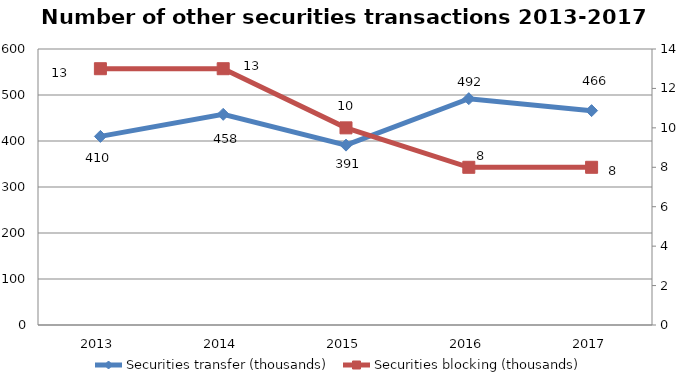
| Category | Securities transfer (thousands) |
|---|---|
| 2013.0 | 410 |
| 2014.0 | 458 |
| 2015.0 | 391 |
| 2016.0 | 492 |
| 2017.0 | 466 |